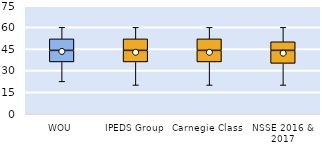
| Category | 25th | 50th | 75th |
|---|---|---|---|
| WOU | 36 | 8 | 8 |
| IPEDS Group | 36 | 8 | 8 |
| Carnegie Class | 36 | 8 | 8 |
| NSSE 2016 & 2017 | 35 | 9 | 6 |